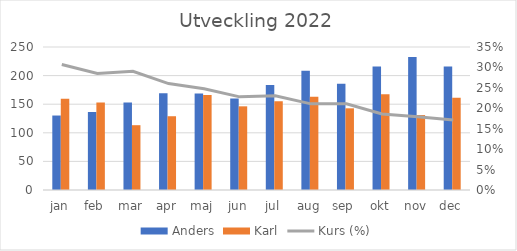
| Category | Anders | Karl |
|---|---|---|
| jan | 130.2 | 159.58 |
| feb | 136.4 | 153 |
| mar | 152.95 | 113.3 |
| apr | 169.2 | 128.96 |
| maj | 168.75 | 165.9 |
| jun | 159.9 | 146.28 |
| jul | 183.6 | 155.15 |
| aug | 208.6 | 163.08 |
| sep | 185.6 | 142.79 |
| okt | 216 | 167.2 |
| nov | 232.5 | 130.98 |
| dec | 216 | 161.28 |